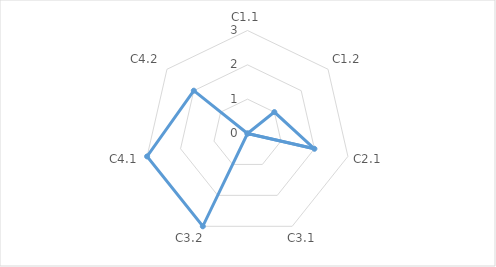
| Category | Series 0 |
|---|---|
| C1.1 | 0 |
| C1.2 | 1 |
| C2.1 | 2 |
| C3.1 | 0 |
| C3.2 | 3 |
| C4.1 | 3 |
| C4.2 | 2 |